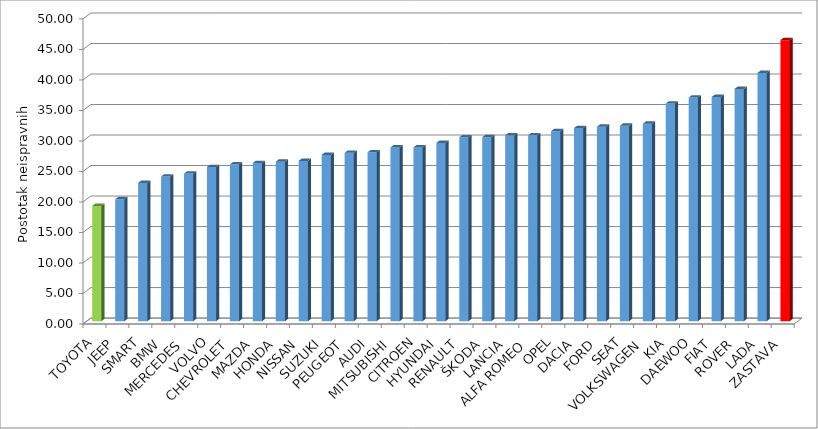
| Category | Series 4 |
|---|---|
| TOYOTA | 18.894 |
| JEEP | 19.989 |
| SMART | 22.658 |
| BMW | 23.7 |
| MERCEDES | 24.189 |
| VOLVO | 25.269 |
| CHEVROLET | 25.707 |
| MAZDA | 25.919 |
| HONDA | 26.149 |
| NISSAN | 26.274 |
| SUZUKI | 27.25 |
| PEUGEOT | 27.588 |
| AUDI | 27.67 |
| MITSUBISHI | 28.484 |
| CITROEN | 28.487 |
| HYUNDAI | 29.213 |
| RENAULT | 30.135 |
| ŠKODA | 30.16 |
| LANCIA | 30.449 |
| ALFA ROMEO | 30.465 |
| OPEL | 31.143 |
| DACIA | 31.652 |
| FORD | 31.877 |
| SEAT | 32.038 |
| VOLKSWAGEN | 32.367 |
| KIA | 35.675 |
| DAEWOO | 36.656 |
| FIAT | 36.745 |
| ROVER | 38.07 |
| LADA | 40.694 |
| ZASTAVA | 46.064 |